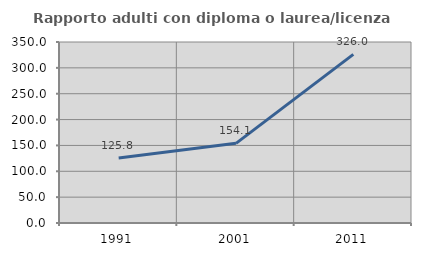
| Category | Rapporto adulti con diploma o laurea/licenza media  |
|---|---|
| 1991.0 | 125.806 |
| 2001.0 | 154.054 |
| 2011.0 | 326 |